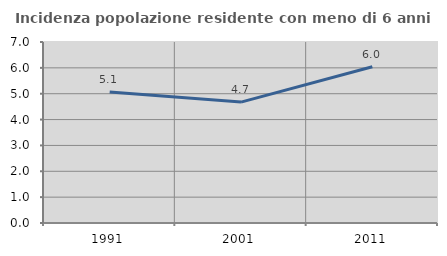
| Category | Incidenza popolazione residente con meno di 6 anni |
|---|---|
| 1991.0 | 5.067 |
| 2001.0 | 4.676 |
| 2011.0 | 6.043 |